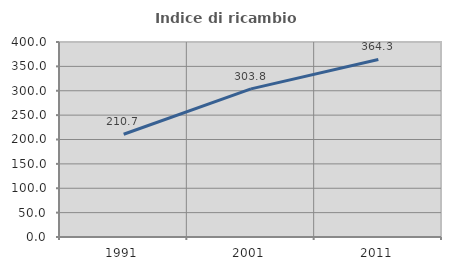
| Category | Indice di ricambio occupazionale  |
|---|---|
| 1991.0 | 210.74 |
| 2001.0 | 303.807 |
| 2011.0 | 364.268 |